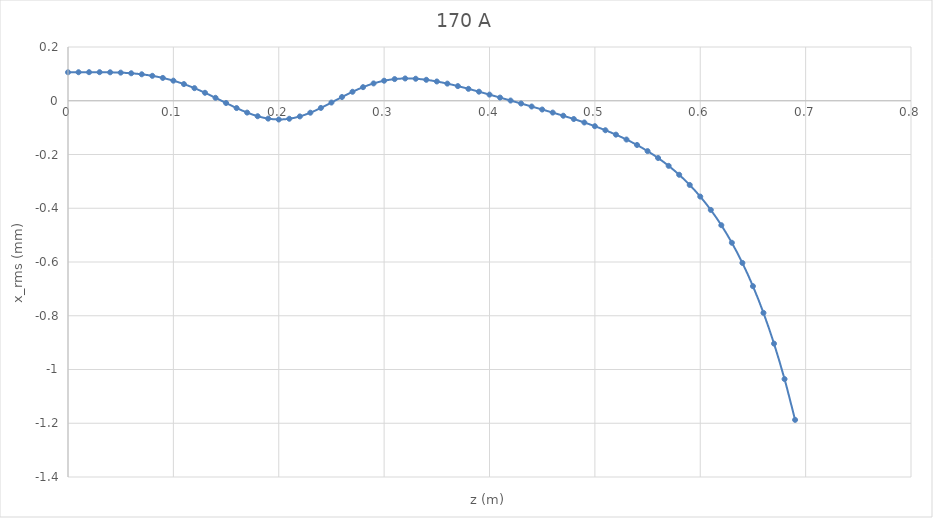
| Category | Series 0 |
|---|---|
| 0.0 | 0.106 |
| 0.01 | 0.106 |
| 0.02 | 0.106 |
| 0.03 | 0.106 |
| 0.04 | 0.106 |
| 0.05 | 0.105 |
| 0.06 | 0.102 |
| 0.07 | 0.098 |
| 0.08 | 0.093 |
| 0.09 | 0.085 |
| 0.1 | 0.075 |
| 0.11 | 0.062 |
| 0.12 | 0.047 |
| 0.13 | 0.03 |
| 0.14 | 0.011 |
| 0.15 | -0.008 |
| 0.16 | -0.027 |
| 0.17 | -0.044 |
| 0.18 | -0.058 |
| 0.19 | -0.066 |
| 0.2 | -0.07 |
| 0.21 | -0.067 |
| 0.22 | -0.058 |
| 0.23 | -0.044 |
| 0.24 | -0.027 |
| 0.25 | -0.007 |
| 0.26 | 0.014 |
| 0.27 | 0.033 |
| 0.28 | 0.051 |
| 0.29 | 0.064 |
| 0.3 | 0.075 |
| 0.31 | 0.081 |
| 0.32 | 0.083 |
| 0.33 | 0.082 |
| 0.34 | 0.078 |
| 0.35 | 0.072 |
| 0.36 | 0.064 |
| 0.37 | 0.054 |
| 0.38 | 0.044 |
| 0.39 | 0.034 |
| 0.4 | 0.023 |
| 0.41 | 0.012 |
| 0.42 | 0.001 |
| 0.43 | -0.01 |
| 0.44 | -0.021 |
| 0.45 | -0.033 |
| 0.46 | -0.044 |
| 0.47 | -0.056 |
| 0.48 | -0.068 |
| 0.49 | -0.081 |
| 0.5 | -0.095 |
| 0.51 | -0.11 |
| 0.52 | -0.126 |
| 0.53 | -0.144 |
| 0.54 | -0.165 |
| 0.55 | -0.187 |
| 0.56 | -0.213 |
| 0.57 | -0.242 |
| 0.58 | -0.275 |
| 0.59 | -0.313 |
| 0.6 | -0.357 |
| 0.61 | -0.406 |
| 0.62 | -0.463 |
| 0.63 | -0.528 |
| 0.64 | -0.604 |
| 0.65 | -0.69 |
| 0.66 | -0.789 |
| 0.67 | -0.904 |
| 0.68 | -1.036 |
| 0.69 | -1.187 |